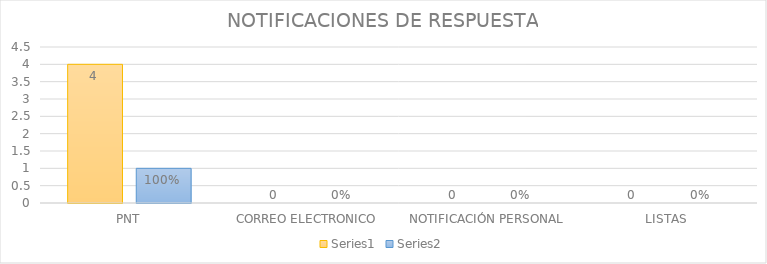
| Category | Series 3 | Series 4 |
|---|---|---|
| PNT | 4 | 1 |
| CORREO ELECTRONICO | 0 | 0 |
| NOTIFICACIÓN PERSONAL | 0 | 0 |
| LISTAS | 0 | 0 |